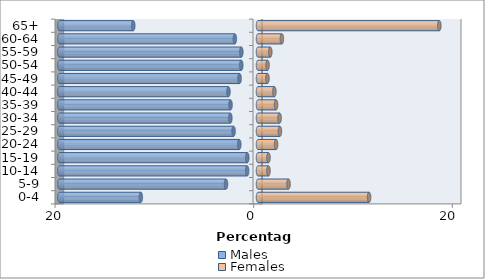
| Category | Males | Females |
|---|---|---|
| 0-4 | -11.794 | 11.182 |
| 5-9 | -3.22 | 3.072 |
| 10-14 | -1.093 | 1.053 |
| 15-19 | -1.077 | 1.055 |
| 20-24 | -1.886 | 1.822 |
| 25-29 | -2.46 | 2.206 |
| 30-34 | -2.784 | 2.174 |
| 35-39 | -2.767 | 1.816 |
| 40-44 | -2.975 | 1.649 |
| 45-49 | -1.854 | 0.953 |
| 50-54 | -1.684 | 0.961 |
| 55-59 | -1.68 | 1.236 |
| 60-64 | -2.331 | 2.403 |
| 65+ | -12.559 | 18.254 |